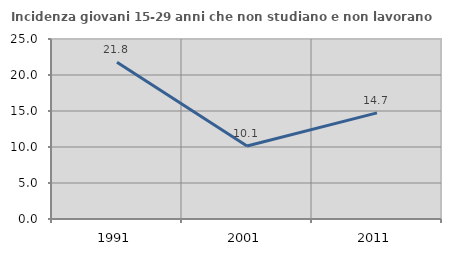
| Category | Incidenza giovani 15-29 anni che non studiano e non lavorano  |
|---|---|
| 1991.0 | 21.774 |
| 2001.0 | 10.13 |
| 2011.0 | 14.738 |